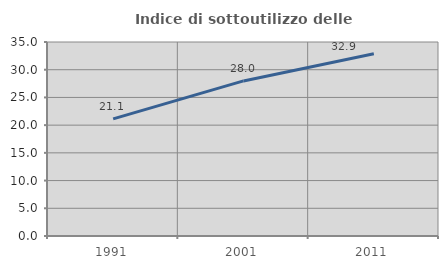
| Category | Indice di sottoutilizzo delle abitazioni  |
|---|---|
| 1991.0 | 21.141 |
| 2001.0 | 27.98 |
| 2011.0 | 32.864 |